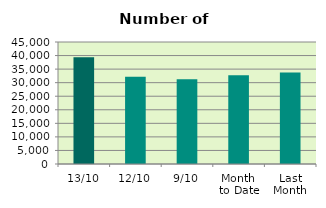
| Category | Series 0 |
|---|---|
| 13/10 | 39364 |
| 12/10 | 32138 |
| 9/10 | 31242 |
| Month 
to Date | 32711.333 |
| Last
Month | 33733.273 |